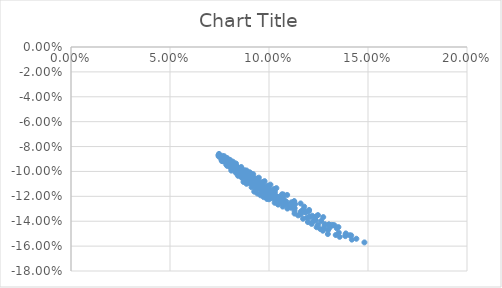
| Category | Series 0 |
|---|---|
| 0.07615607549047824 | -0.092 |
| 0.07877305631354622 | -0.094 |
| 0.08311017332157211 | -0.1 |
| 0.08609787702386693 | -0.103 |
| 0.08921966863250613 | -0.106 |
| 0.09302939523460013 | -0.11 |
| 0.09638145663905891 | -0.113 |
| 0.10099290179946921 | -0.117 |
| 0.10512544275322815 | -0.121 |
| 0.10875722411051683 | -0.124 |
| 0.1124574150636154 | -0.127 |
| 0.11803690576881035 | -0.133 |
| 0.12186609241971104 | -0.136 |
| 0.12632478325449656 | -0.14 |
| 0.13024667437498788 | -0.143 |
| 0.1342095482132134 | -0.146 |
| 0.13878760874879983 | -0.15 |
| 0.14412217252598514 | -0.154 |
| 0.14819266356831606 | -0.157 |
| 0.08097337718755643 | -0.099 |
| 0.08435692249026934 | -0.103 |
| 0.08628204421536413 | -0.105 |
| 0.08992803754422529 | -0.109 |
| 0.09202136885164423 | -0.111 |
| 0.09529822361594435 | -0.114 |
| 0.09926288868203718 | -0.118 |
| 0.10156602483688142 | -0.12 |
| 0.10510168790048481 | -0.122 |
| 0.10930070131180936 | -0.127 |
| 0.11298213429074667 | -0.13 |
| 0.11607830250839533 | -0.132 |
| 0.12045330586945611 | -0.136 |
| 0.12362184810582243 | -0.139 |
| 0.12808546110236382 | -0.143 |
| 0.13072374399813202 | -0.145 |
| 0.13526004393499896 | -0.149 |
| 0.13853918422230624 | -0.152 |
| 0.14183750156328812 | -0.155 |
| 0.08712487427265074 | -0.108 |
| 0.08861494180642851 | -0.11 |
| 0.09120997229064116 | -0.113 |
| 0.09327830659351849 | -0.114 |
| 0.0960080313862439 | -0.117 |
| 0.09819898181985891 | -0.119 |
| 0.10104349615868038 | -0.122 |
| 0.1033402175334671 | -0.123 |
| 0.10568549681533479 | -0.125 |
| 0.10987419220859852 | -0.129 |
| 0.11291344264698937 | -0.132 |
| 0.11598921567261043 | -0.134 |
| 0.11909868168602519 | -0.137 |
| 0.12223926951434388 | -0.14 |
| 0.1247502536876038 | -0.143 |
| 0.12793763633811828 | -0.146 |
| 0.12987597506570397 | -0.147 |
| 0.1337075646281723 | -0.151 |
| 0.1356709650584211 | -0.153 |
| 0.09255218081299263 | -0.116 |
| 0.09411073083720568 | -0.118 |
| 0.09569845074652779 | -0.119 |
| 0.09731391279235863 | -0.121 |
| 0.09895575830507544 | -0.122 |
| 0.10001065116273306 | -0.122 |
| 0.10286109193659451 | -0.125 |
| 0.10458569473592798 | -0.127 |
| 0.1069069420924416 | -0.128 |
| 0.10927411507333927 | -0.13 |
| 0.1128984049999886 | -0.134 |
| 0.11472688137581337 | -0.135 |
| 0.1171821380484648 | -0.138 |
| 0.11965420672693829 | -0.141 |
| 0.12152673349474503 | -0.142 |
| 0.1240273647004384 | -0.145 |
| 0.12592589201757284 | -0.146 |
| 0.12718735284345575 | -0.148 |
| 0.12971995708438538 | -0.15 |
| 0.07586856253970285 | -0.089 |
| 0.0785499717854709 | -0.092 |
| 0.07988703754241198 | -0.093 |
| 0.08235266802061467 | -0.096 |
| 0.08334210278234908 | -0.096 |
| 0.0848897416982496 | -0.097 |
| 0.08647005681799909 | -0.099 |
| 0.08755402419891237 | -0.099 |
| 0.08919274431758646 | -0.1 |
| 0.09085936636077485 | -0.102 |
| 0.09420904170738646 | -0.106 |
| 0.09708507676079307 | -0.109 |
| 0.10001312876279563 | -0.112 |
| 0.10298876115988298 | -0.114 |
| 0.10720736036121767 | -0.119 |
| 0.11271944061352153 | -0.124 |
| 0.11776852343192719 | -0.128 |
| 0.12472068545098315 | -0.135 |
| 0.13505756763531307 | -0.145 |
| 0.07918571236526259 | -0.095 |
| 0.0810204564720477 | -0.096 |
| 0.08294011649635302 | -0.098 |
| 0.08548271588683937 | -0.101 |
| 0.0870392755814382 | -0.102 |
| 0.08862740322943863 | -0.104 |
| 0.09024543225973282 | -0.105 |
| 0.09189178317672934 | -0.107 |
| 0.09468900734764799 | -0.109 |
| 0.09640017137176035 | -0.111 |
| 0.1004522788283024 | -0.115 |
| 0.10284544650974121 | -0.117 |
| 0.10704163382901459 | -0.121 |
| 0.11131094612843272 | -0.125 |
| 0.11754827365109932 | -0.13 |
| 0.12390660744648908 | -0.136 |
| 0.13164586461923233 | -0.143 |
| 0.1415205185641753 | -0.151 |
| 0.07652800011801408 | -0.092 |
| 0.0806918294873498 | -0.097 |
| 0.08255825706913177 | -0.099 |
| 0.08505938304839948 | -0.102 |
| 0.08764289294577907 | -0.104 |
| 0.08921966863250613 | -0.106 |
| 0.09082655002246673 | -0.107 |
| 0.09302939523460013 | -0.11 |
| 0.09469269568050556 | -0.111 |
| 0.09638145663905891 | -0.113 |
| 0.09809436315911968 | -0.114 |
| 0.10099290179946921 | -0.117 |
| 0.10394024027878047 | -0.12 |
| 0.10755400337987493 | -0.123 |
| 0.11181553723398946 | -0.127 |
| 0.1167974906877044 | -0.131 |
| 0.12312151171963835 | -0.137 |
| 0.13024667437498788 | -0.143 |
| 0.14079982060081633 | -0.151 |
| 0.07891316819823546 | -0.096 |
| 0.08322238550693387 | -0.101 |
| 0.08571150276857493 | -0.104 |
| 0.0888587336771594 | -0.108 |
| 0.09151012595600586 | -0.111 |
| 0.09370700384365319 | -0.113 |
| 0.0942299154160143 | -0.114 |
| 0.09647124512382929 | -0.116 |
| 0.09814968413792585 | -0.118 |
| 0.09929423400771525 | -0.119 |
| 0.10100835160064654 | -0.12 |
| 0.10274468166324353 | -0.122 |
| 0.10568549681533479 | -0.125 |
| 0.10807617289527215 | -0.126 |
| 0.11110113523504775 | -0.129 |
| 0.11602723839828927 | -0.133 |
| 0.12045330586945611 | -0.136 |
| 0.12817704228988083 | -0.142 |
| 0.07446614987493345 | -0.087 |
| 0.07475477381057687 | -0.086 |
| 0.0765102812641472 | -0.087 |
| 0.07740217052859845 | -0.088 |
| 0.078828948914367 | -0.089 |
| 0.0802953965209094 | -0.091 |
| 0.08179937988185981 | -0.092 |
| 0.0833388668435326 | -0.094 |
| 0.08596704605826724 | -0.096 |
| 0.08866929848743521 | -0.099 |
| 0.09033426068551265 | -0.101 |
| 0.09202582867892548 | -0.102 |
| 0.09487347092785486 | -0.105 |
| 0.09777598392654248 | -0.108 |
| 0.10072862445580165 | -0.111 |
| 0.10372711189347636 | -0.113 |
| 0.10917916760776945 | -0.119 |
| 0.11597267200164325 | -0.126 |
| 0.07459671330335449 | -0.088 |
| 0.07667137235587924 | -0.09 |
| 0.07751684210248344 | -0.09 |
| 0.07988703754241198 | -0.093 |
| 0.08082723577111063 | -0.093 |
| 0.08232084405873377 | -0.094 |
| 0.08385011044588173 | -0.096 |
| 0.0854131196487477 | -0.097 |
| 0.08753719397889197 | -0.1 |
| 0.09025628852800331 | -0.103 |
| 0.09192587094990792 | -0.104 |
| 0.09362144098468346 | -0.106 |
| 0.09648172032455948 | -0.109 |
| 0.0993952499195708 | -0.111 |
| 0.10235748268402634 | -0.114 |
| 0.10656051988303182 | -0.118 |
| 0.11271944061352153 | -0.124 |
| 0.12026037081303788 | -0.131 |
| 0.13306003182947443 | -0.143 |
| 0.0760024876271865 | -0.09 |
| 0.07812448372727962 | -0.092 |
| 0.08048463417644752 | -0.095 |
| 0.08139974617624975 | -0.095 |
| 0.08288238340708168 | -0.097 |
| 0.08440083300548414 | -0.098 |
| 0.08649346123482175 | -0.101 |
| 0.08807982339103942 | -0.102 |
| 0.08969633254439295 | -0.104 |
| 0.09134138813447318 | -0.105 |
| 0.09301347553903781 | -0.107 |
| 0.09471116306154424 | -0.108 |
| 0.09813469467842206 | -0.112 |
| 0.09989136043647623 | -0.114 |
| 0.10284544650974121 | -0.117 |
| 0.10647818411332863 | -0.119 |
| 0.11318553844670459 | -0.126 |
| 0.12014273472063401 | -0.132 |
| 0.1323511059897639 | -0.143 |
| 0.07837082995310664 | -0.094 |
| 0.08112212524916342 | -0.097 |
| 0.08356643592946998 | -0.1 |
| 0.08505938304839948 | -0.102 |
| 0.08658688356959748 | -0.103 |
| 0.08870898966355684 | -0.106 |
| 0.08921966863250613 | -0.106 |
| 0.09082655002246673 | -0.107 |
| 0.09302939523460013 | -0.11 |
| 0.09469269568050556 | -0.111 |
| 0.09638145663905891 | -0.113 |
| 0.09694979919482824 | -0.113 |
| 0.09924597971143474 | -0.116 |
| 0.10216207221345729 | -0.119 |
| 0.10394024027878047 | -0.12 |
| 0.10755400337987493 | -0.123 |
| 0.11181553723398946 | -0.127 |
| 0.1186992327284119 | -0.133 |
| 0.13024667437498788 | -0.143 |
| 0.07652800011801408 | -0.092 |
| 0.1386579884865655 | -0.151 |
| 0.12738991357986285 | -0.137 |